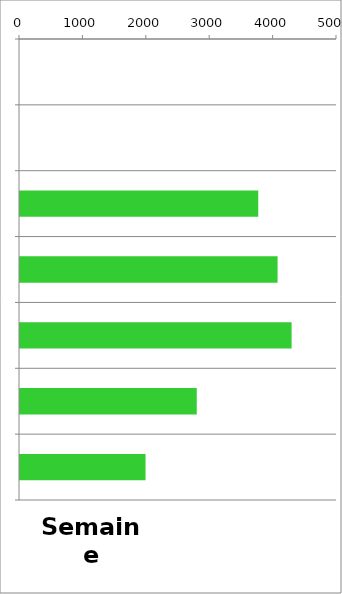
| Category | TV |
|---|---|
| 0 | 0 |
| 1 | 0 |
| 2 | 3758 |
| 3 | 4063 |
| 4 | 4284 |
| 5 | 2788 |
| 6 | 1980 |